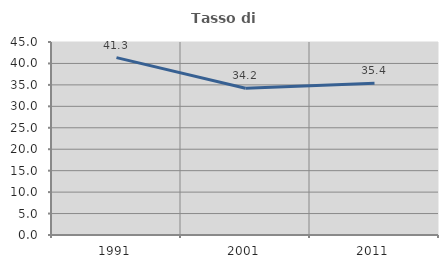
| Category | Tasso di occupazione   |
|---|---|
| 1991.0 | 41.349 |
| 2001.0 | 34.202 |
| 2011.0 | 35.385 |